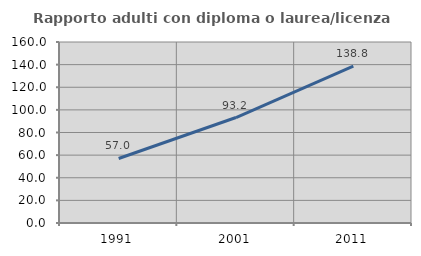
| Category | Rapporto adulti con diploma o laurea/licenza media  |
|---|---|
| 1991.0 | 57.037 |
| 2001.0 | 93.243 |
| 2011.0 | 138.76 |